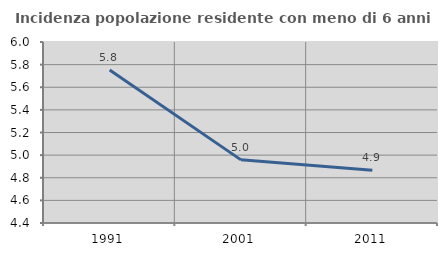
| Category | Incidenza popolazione residente con meno di 6 anni |
|---|---|
| 1991.0 | 5.753 |
| 2001.0 | 4.958 |
| 2011.0 | 4.866 |